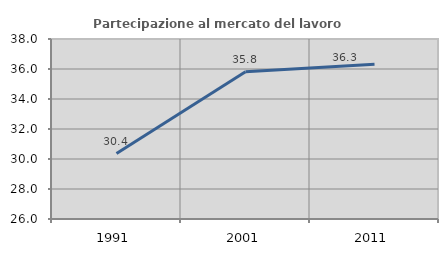
| Category | Partecipazione al mercato del lavoro  femminile |
|---|---|
| 1991.0 | 30.365 |
| 2001.0 | 35.816 |
| 2011.0 | 36.322 |